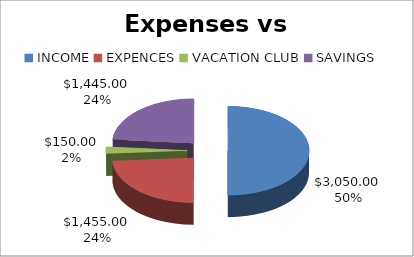
| Category | Series 0 |
|---|---|
| INCOME | 3050 |
| EXPENCES | 1455 |
| VACATION CLUB | 150 |
| SAVINGS | 1445 |